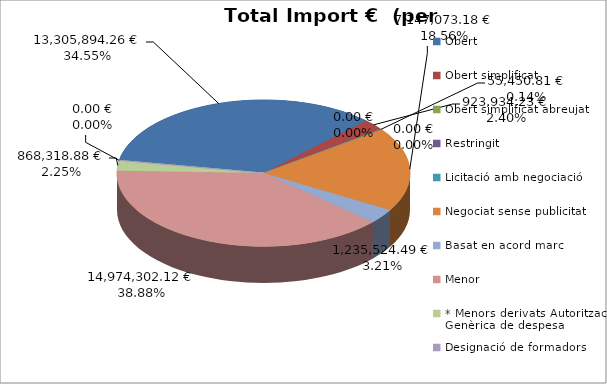
| Category | Total preu              (amb iva) |
|---|---|
| Obert | 13305894.26 |
| Obert simplificat | 923934.23 |
| Obert simplificat abreujat | 55450.81 |
| Restringit | 0 |
| Licitació amb negociació | 0 |
| Negociat sense publicitat | 7147073.18 |
| Basat en acord marc | 1235524.49 |
| Menor | 14974302.12 |
| * Menors derivats Autorització Genèrica de despesa | 868318.88 |
| Designació de formadors | 0 |